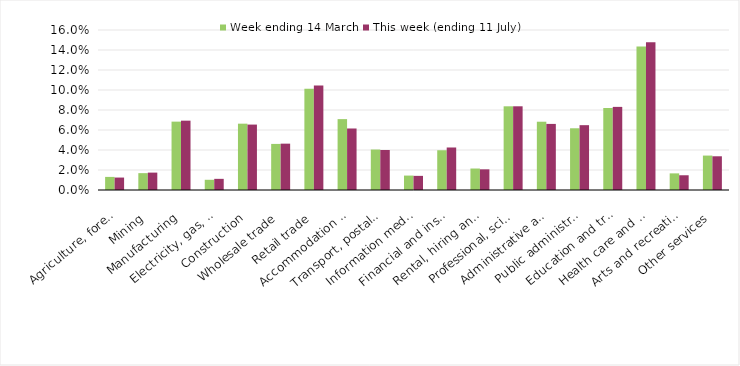
| Category | Week ending 14 March | This week (ending 11 July) |
|---|---|---|
| Agriculture, forestry and fishing | 0.013 | 0.012 |
| Mining | 0.017 | 0.017 |
| Manufacturing | 0.068 | 0.069 |
| Electricity, gas, water and waste services | 0.01 | 0.011 |
| Construction | 0.066 | 0.065 |
| Wholesale trade | 0.046 | 0.046 |
| Retail trade | 0.101 | 0.105 |
| Accommodation and food services | 0.071 | 0.062 |
| Transport, postal and warehousing | 0.04 | 0.04 |
| Information media and telecommunications | 0.014 | 0.014 |
| Financial and insurance services | 0.04 | 0.043 |
| Rental, hiring and real estate services | 0.021 | 0.021 |
| Professional, scientific and technical services | 0.084 | 0.084 |
| Administrative and support services | 0.068 | 0.066 |
| Public administration and safety | 0.062 | 0.065 |
| Education and training | 0.082 | 0.083 |
| Health care and social assistance | 0.143 | 0.148 |
| Arts and recreation services | 0.017 | 0.015 |
| Other services | 0.034 | 0.034 |